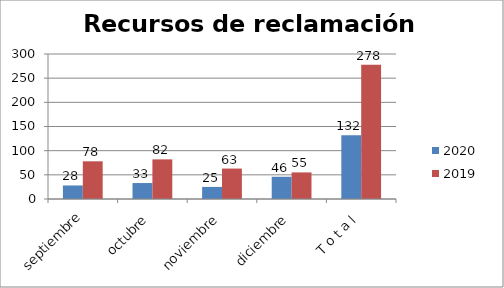
| Category | 2020 | 2019 |
|---|---|---|
| septiembre | 28 | 78 |
| octubre | 33 | 82 |
| noviembre | 25 | 63 |
| diciembre | 46 | 55 |
| T o t a l | 132 | 278 |